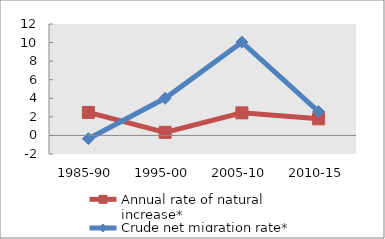
| Category | Annual rate of natural increase* | Crude net migration rate* |
|---|---|---|
| 1985-90 | 2.477 | -0.35 |
| 1995-00 | 0.332 | 3.995 |
| 2005-10 | 2.432 | 10.048 |
| 2010-15 | 1.787 | 2.57 |